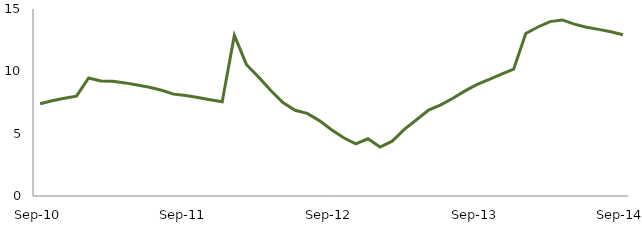
| Category | Series 0 |
|---|---|
| Sep-10 | 7.4 |
|  | 7.635 |
|  | 7.833 |
|  | 8.011 |
|  | 9.465 |
|  | 9.221 |
|  | 9.199 |
|  | 9.073 |
|  | 8.902 |
|  | 8.725 |
|  | 8.478 |
|  | 8.171 |
| Sep-11 | 8.061 |
|  | 7.897 |
|  | 7.718 |
|  | 7.555 |
|  | 12.888 |
|  | 10.533 |
|  | 9.535 |
|  | 8.464 |
|  | 7.503 |
|  | 6.876 |
|  | 6.627 |
|  | 6.048 |
| Sep-12 | 5.317 |
|  | 4.667 |
|  | 4.185 |
|  | 4.593 |
|  | 3.923 |
|  | 4.399 |
|  | 5.348 |
|  | 6.118 |
|  | 6.892 |
|  | 7.316 |
|  | 7.838 |
|  | 8.434 |
| Sep-13 | 8.951 |
|  | 9.352 |
|  | 9.785 |
|  | 10.174 |
|  | 13.032 |
|  | 13.557 |
|  | 13.989 |
|  | 14.123 |
|  | 13.79 |
|  | 13.541 |
|  | 13.364 |
|  | 13.18 |
| Sep-14 | 12.932 |